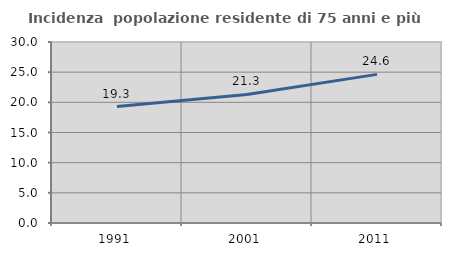
| Category | Incidenza  popolazione residente di 75 anni e più |
|---|---|
| 1991.0 | 19.293 |
| 2001.0 | 21.307 |
| 2011.0 | 24.633 |